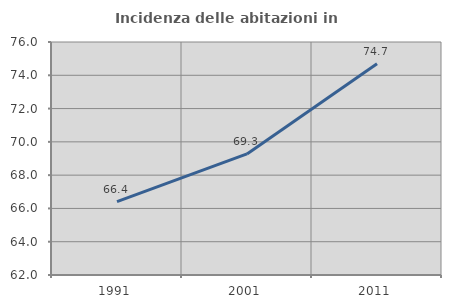
| Category | Incidenza delle abitazioni in proprietà  |
|---|---|
| 1991.0 | 66.41 |
| 2001.0 | 69.276 |
| 2011.0 | 74.696 |